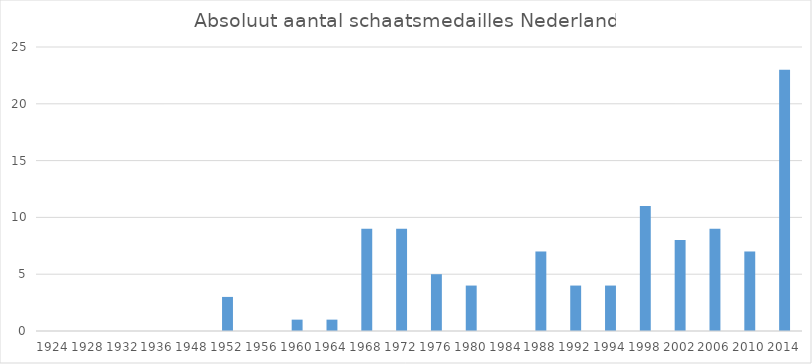
| Category | M.A. medailles |
|---|---|
| 1924.0 | 0 |
| 1928.0 | 0 |
| 1932.0 | 0 |
| 1936.0 | 0 |
| 1948.0 | 0 |
| 1952.0 | 3 |
| 1956.0 | 0 |
| 1960.0 | 1 |
| 1964.0 | 1 |
| 1968.0 | 9 |
| 1972.0 | 9 |
| 1976.0 | 5 |
| 1980.0 | 4 |
| 1984.0 | 0 |
| 1988.0 | 7 |
| 1992.0 | 4 |
| 1994.0 | 4 |
| 1998.0 | 11 |
| 2002.0 | 8 |
| 2006.0 | 9 |
| 2010.0 | 7 |
| 2014.0 | 23 |